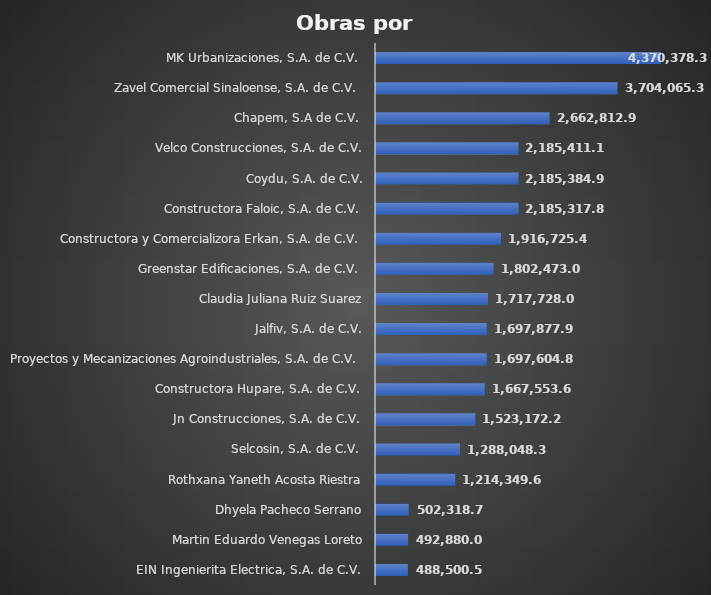
| Category | Suma  |
|---|---|
| EIN Ingenierita Electrica, S.A. de C.V.  | 488500.5 |
| Martin Eduardo Venegas Loreto | 492880.06 |
| Dhyela Pacheco Serrano | 502318.77 |
| Rothxana Yaneth Acosta Riestra | 1214349.69 |
| Selcosin, S.A. de C.V.  | 1288048.38 |
| Jn Construcciones, S.A. de C.V.  | 1523172.23 |
| Constructora Hupare, S.A. de C.V.  | 1667553.61 |
| Proyectos y Mecanizaciones Agroindustriales, S.A. de C.V.  | 1697604.84 |
| Jalfiv, S.A. de C.V. | 1697877.9 |
| Claudia Juliana Ruiz Suarez | 1717728 |
| Greenstar Edificaciones, S.A. de C.V.  | 1802473.08 |
| Constructora y Comercializora Erkan, S.A. de C.V.  | 1916725.43 |
| Constructora Faloic, S.A. de C.V.  | 2185317.84 |
| Coydu, S.A. de C.V. | 2185384.92 |
| Velco Construcciones, S.A. de C.V. | 2185411.17 |
| Chapem, S.A de C.V.  | 2662812.9 |
| Zavel Comercial Sinaloense, S.A. de C.V.  | 3704065.35 |
| MK Urbanizaciones, S.A. de C.V.  | 4370378.37 |